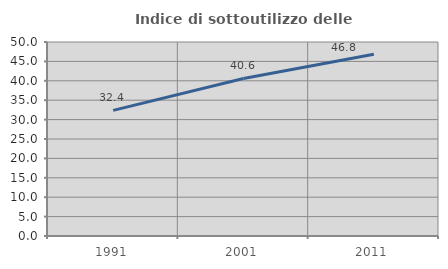
| Category | Indice di sottoutilizzo delle abitazioni  |
|---|---|
| 1991.0 | 32.368 |
| 2001.0 | 40.602 |
| 2011.0 | 46.833 |